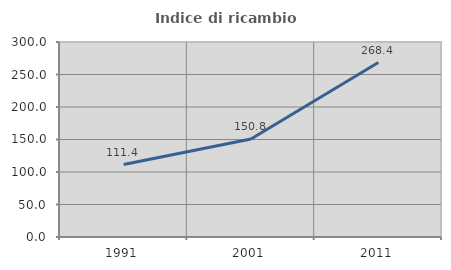
| Category | Indice di ricambio occupazionale  |
|---|---|
| 1991.0 | 111.421 |
| 2001.0 | 150.798 |
| 2011.0 | 268.437 |